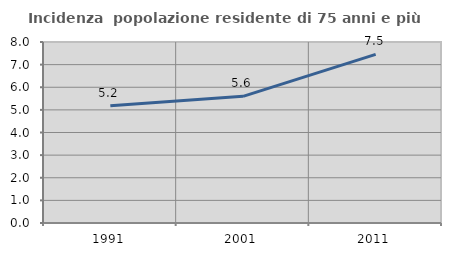
| Category | Incidenza  popolazione residente di 75 anni e più |
|---|---|
| 1991.0 | 5.184 |
| 2001.0 | 5.598 |
| 2011.0 | 7.45 |